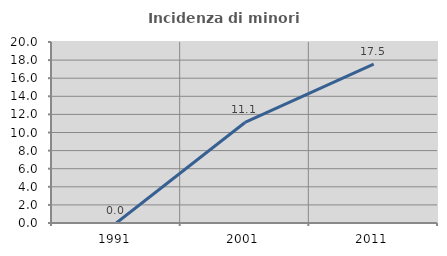
| Category | Incidenza di minori stranieri |
|---|---|
| 1991.0 | 0 |
| 2001.0 | 11.111 |
| 2011.0 | 17.544 |